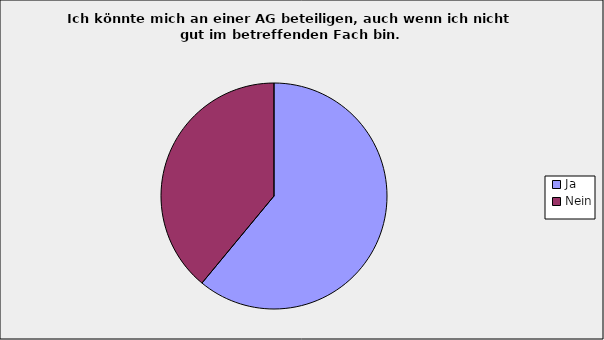
| Category | Series 0 |
|---|---|
| Ja | 0.61 |
| Nein | 0.39 |